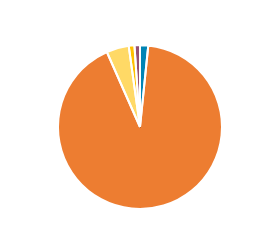
| Category | Series 0 |
|---|---|
| PC/MC | 2078 |
| CAR/LGV | 118308 |
| OGV1 & PSV 2Axle | 5702 |
| OGV1 & PSV 3 Axle | 1443 |
| OGV2 | 1394 |